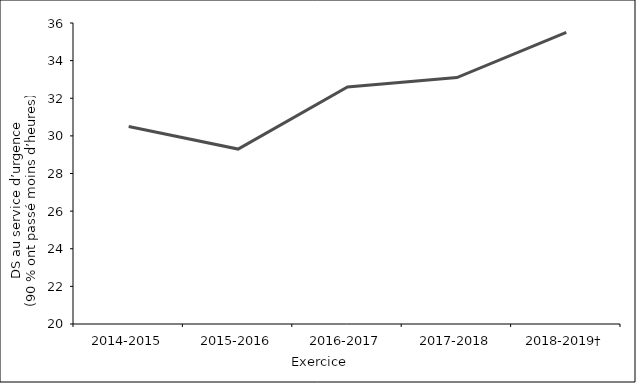
| Category | Series 0 |
|---|---|
| 2014-2015 | 30.5 |
| 2015-2016 | 29.3 |
| 2016-2017 | 32.6 |
| 2017-2018 | 33.1 |
| 2018-2019† | 35.5 |